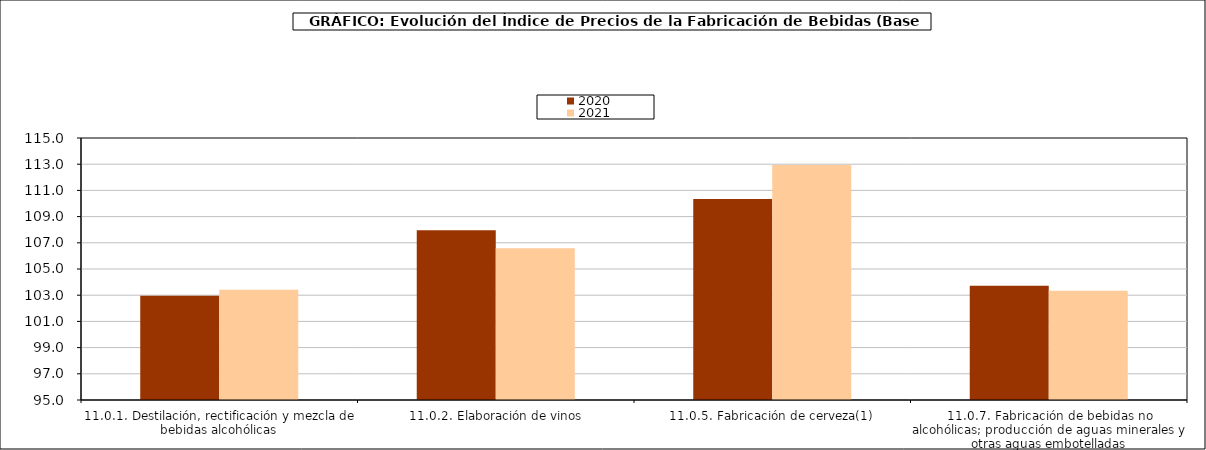
| Category | 2020 | 2021 |
|---|---|---|
| 11.0.1. Destilación, rectificación y mezcla de bebidas alcohólicas | 102.967 | 103.407 |
| 11.0.2. Elaboración de vinos | 107.966 | 106.576 |
| 11.0.5. Fabricación de cerveza(1) | 110.346 | 112.932 |
| 11.0.7. Fabricación de bebidas no alcohólicas; producción de aguas minerales y otras aguas embotelladas | 103.721 | 103.349 |